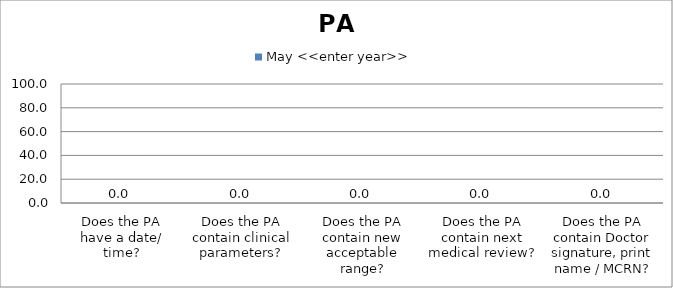
| Category | May <<enter year>> |
|---|---|
| Does the PA have a date/ time? | 0 |
| Does the PA contain clinical parameters? | 0 |
| Does the PA contain new acceptable range? | 0 |
| Does the PA contain next medical review? | 0 |
| Does the PA contain Doctor signature, print name / MCRN? | 0 |